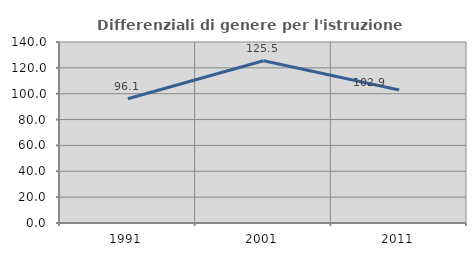
| Category | Differenziali di genere per l'istruzione superiore |
|---|---|
| 1991.0 | 96.062 |
| 2001.0 | 125.546 |
| 2011.0 | 102.898 |